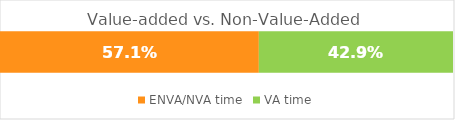
| Category | ENVA/NVA time | VA time |
|---|---|---|
| 0 | 0.571 | 0.429 |